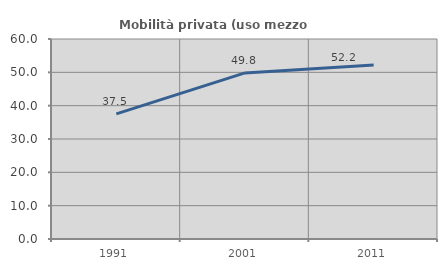
| Category | Mobilità privata (uso mezzo privato) |
|---|---|
| 1991.0 | 37.524 |
| 2001.0 | 49.834 |
| 2011.0 | 52.209 |